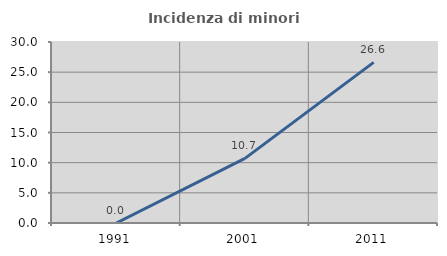
| Category | Incidenza di minori stranieri |
|---|---|
| 1991.0 | 0 |
| 2001.0 | 10.714 |
| 2011.0 | 26.623 |